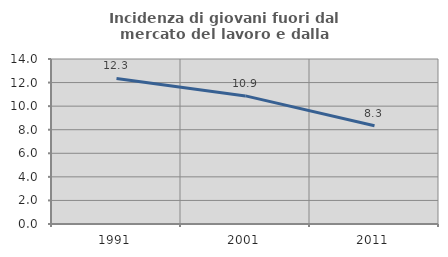
| Category | Incidenza di giovani fuori dal mercato del lavoro e dalla formazione  |
|---|---|
| 1991.0 | 12.346 |
| 2001.0 | 10.87 |
| 2011.0 | 8.333 |